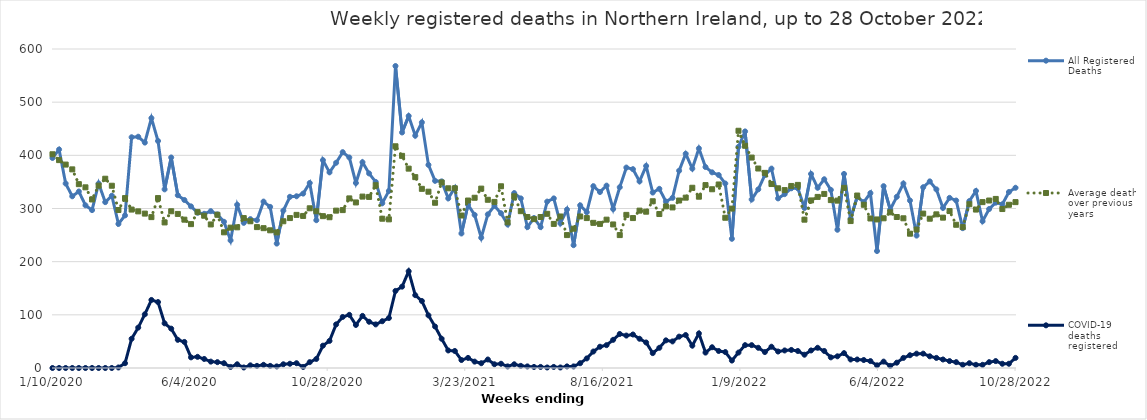
| Category | All Registered Deaths | Average deaths over previous 5 years | COVID-19 deaths registered |
|---|---|---|---|
| 1/10/20 | 395 | 402 | 0 |
| 1/17/20 | 411 | 391 | 0 |
| 1/24/20 | 347 | 382.6 | 0 |
| 1/31/20 | 323 | 373.6 | 0 |
| 2/7/20 | 332 | 345.8 | 0 |
| 2/14/20 | 306 | 339.8 | 0 |
| 2/21/20 | 297 | 317 | 0 |
| 2/28/20 | 347 | 343 | 0 |
| 3/6/20 | 312 | 356 | 0 |
| 3/13/20 | 324 | 342.8 | 0 |
| 3/20/20 | 271 | 297.2 | 1 |
| 3/27/20 | 287 | 319.6 | 9 |
| 4/3/20 | 434 | 298 | 55 |
| 4/10/20 | 435 | 294.6 | 76 |
| 4/17/20 | 424 | 290.4 | 101 |
| 4/24/20 | 470 | 283.8 | 128 |
| 5/1/20 | 427 | 319.6 | 124 |
| 5/8/20 | 336 | 273.8 | 84 |
| 5/15/20 | 396 | 294.8 | 74 |
| 5/22/20 | 325 | 289.8 | 53 |
| 5/29/20 | 316 | 279 | 49 |
| 6/5/20 | 304 | 270.6 | 20 |
| 6/12/20 | 292 | 293.2 | 21 |
| 6/19/20 | 290 | 286.4 | 17 |
| 6/26/20 | 295 | 270 | 12 |
| 7/3/20 | 289 | 288.2 | 11 |
| 7/10/20 | 275 | 255.2 | 9 |
| 7/17/20 | 240 | 264 | 2 |
| 7/24/20 | 307 | 264.6 | 7 |
| 7/31/20 | 273 | 282 | 1 |
| 8/7/20 | 280 | 276 | 5 |
| 8/14/20 | 278 | 265 | 4 |
| 8/21/20 | 313 | 263 | 6 |
| 8/28/20 | 303 | 259 | 4 |
| 9/4/20 | 234 | 255 | 3 |
| 9/11/20 | 296 | 276 | 7 |
| 9/18/20 | 322 | 282 | 8 |
| 9/25/20 | 323 | 288 | 9 |
| 10/2/20 | 328 | 286 | 2 |
| 10/9/20 | 348 | 300.4 | 11 |
| 10/16/20 | 278 | 294.8 | 17 |
| 10/23/20 | 391 | 285.6 | 42 |
| 10/30/20 | 368 | 283.6 | 51 |
| 11/6/20 | 386 | 296 | 82 |
| 11/13/20 | 406 | 297 | 96 |
| 11/20/20 | 396 | 319 | 100 |
| 11/27/20 | 348 | 311.4 | 81 |
| 12/4/20 | 387 | 322.4 | 98 |
| 12/11/20 | 366 | 321.8 | 87 |
| 12/18/20 | 350 | 343.8 | 82 |
| 12/25/20 | 310 | 280.8 | 88 |
| 1/1/21 | 333 | 279.6 | 94 |
| 1/8/21 | 568 | 417 | 145 |
| 1/15/21 | 443 | 399 | 153 |
| 1/22/21 | 474 | 375 | 182 |
| 1/29/21 | 437 | 359 | 137 |
| 2/5/21 | 462 | 337 | 126 |
| 2/12/21 | 382 | 331.6 | 99 |
| 2/19/21 | 352 | 310.8 | 78 |
| 2/26/21 | 351 | 349 | 55 |
| 3/5/21 | 319 | 338 | 33 |
| 3/12/21 | 339 | 338 | 32 |
| 3/19/21 | 253 | 286.8 | 15 |
| 3/26/21 | 307 | 315 | 19 |
| 4/2/21 | 288 | 320.2 | 12 |
| 4/9/21 | 245 | 337.4 | 9 |
| 4/16/21 | 289 | 316.4 | 16 |
| 4/23/21 | 305 | 312.4 | 7 |
| 4/30/21 | 291 | 341.8 | 8 |
| 5/7/21 | 270 | 274 | 3 |
| 5/14/21 | 329 | 323 | 7 |
| 5/21/21 | 319 | 295 | 4 |
| 5/28/21 | 265 | 284 | 3 |
| 6/4/21 | 282 | 280 | 2 |
| 6/11/21 | 265 | 284 | 2 |
| 6/18/21 | 313 | 290 | 1 |
| 6/25/21 | 319 | 271 | 2 |
| 7/2/21 | 272 | 285 | 1 |
| 7/9/21 | 298 | 250 | 3 |
| 7/16/21 | 231 | 262 | 3 |
| 7/23/21 | 306 | 285 | 9 |
| 7/30/21 | 293 | 282 | 18 |
| 8/6/21 | 342 | 273 | 31 |
| 8/13/21 | 331 | 271 | 40 |
| 8/20/21 | 343 | 279 | 43 |
| 8/27/21 | 299 | 270 | 53 |
| 9/3/21 | 340 | 250 | 64 |
| 9/10/21 | 377 | 288 | 61 |
| 9/17/21 | 374 | 282 | 63 |
| 9/24/21 | 351 | 296 | 55 |
| 10/1/21 | 380 | 294 | 48 |
| 10/8/21 | 330 | 313.6 | 28 |
| 10/15/21 | 337 | 289.6 | 38 |
| 10/22/21 | 313 | 304 | 52 |
| 10/29/21 | 320 | 302 | 50 |
| 11/5/21 | 371 | 315 | 59 |
| 11/12/21 | 403 | 320.4 | 62 |
| 11/19/21 | 375 | 339 | 42 |
| 11/26/21 | 413 | 322.2 | 65 |
| 12/3/21 | 378 | 344 | 29 |
| 12/10/21 | 368 | 336.2 | 39 |
| 12/17/21 | 363 | 345.2 | 32 |
| 12/24/21 | 347 | 282.6 | 30 |
| 12/31/21 | 243 | 299.8 | 14 |
| 1/7/22 | 416 | 446.2 | 29 |
| 1/14/22 | 445 | 418 | 43 |
| 1/21/22 | 317 | 395.8 | 43 |
| 1/28/22 | 336 | 375.2 | 38 |
| 2/4/22 | 363 | 367 | 30 |
| 2/11/22 | 375 | 346 | 40 |
| 2/18/22 | 319 | 338 | 31 |
| 2/25/22 | 327 | 334.6 | 33 |
| 3/4/22 | 338 | 342.4 | 34 |
| 3/11/22 | 338 | 344.4 | 32 |
| 3/18/22 | 301 | 279 | 25 |
| 3/25/22 | 365 | 315.2 | 33 |
| 4/1/22 | 339 | 321.8 | 38 |
| 4/8/22 | 355 | 327.4 | 32 |
| 4/15/22 | 335 | 315.8 | 20 |
| 4/22/22 | 260 | 314.8 | 22 |
| 4/29/22 | 365 | 338.8 | 28 |
| 5/6/22 | 281 | 276.4 | 16 |
| 5/13/22 | 322 | 324.4 | 16 |
| 5/20/22 | 312 | 307 | 15 |
| 5/27/22 | 329 | 281.2 | 13 |
| 6/3/22 | 220 | 279.4 | 5 |
| 6/10/22 | 342 | 281.6 | 12 |
| 6/17/22 | 298 | 292.8 | 4 |
| 6/24/22 | 322 | 284 | 10 |
| 7/1/22 | 347 | 281.6 | 19 |
| 7/8/22 | 315 | 252.6 | 24 |
| 7/15/22 | 249 | 260.4 | 27 |
| 7/22/22 | 340 | 290.4 | 27 |
| 7/29/22 | 351 | 280.8 | 22 |
| 8/5/22 | 336 | 289 | 19 |
| 8/12/22 | 301 | 282.8 | 16 |
| 8/19/22 | 320 | 295.2 | 13 |
| 8/26/22 | 315 | 269.4 | 11 |
| 9/2/22 | 263 | 265 | 6 |
| 9/9/22 | 314 | 308 | 9 |
| 9/16/22 | 333 | 298 | 6 |
| 9/23/22 | 276 | 312 | 6 |
| 9/30/22 | 299 | 315 | 11 |
| 10/7/22 | 311 | 318 | 13 |
| 10/14/22 | 308 | 299 | 8 |
| 10/21/22 | 331 | 307 | 8 |
| 10/28/22 | 339 | 312 | 19 |